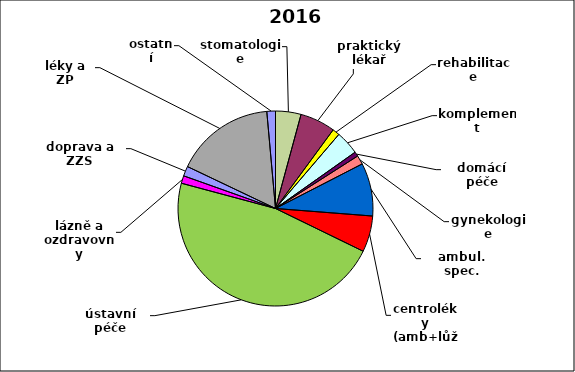
| Category | Series 0 |
|---|---|
| stomatologie | 0.042 |
| praktický lékař | 0.058 |
| rehabilitace | 0.012 |
| komplement | 0.039 |
| domácí péče | 0.008 |
| gynekologie | 0.015 |
| ambul. spec. | 0.088 |
| centroléky (amb+lůž) | 0.06 |
| ústavní péče | 0.47 |
| lázně a ozdravovny | 0.013 |
| doprava a ZZS | 0.016 |
| léky a ZP | 0.165 |
| ostatní | 0.014 |